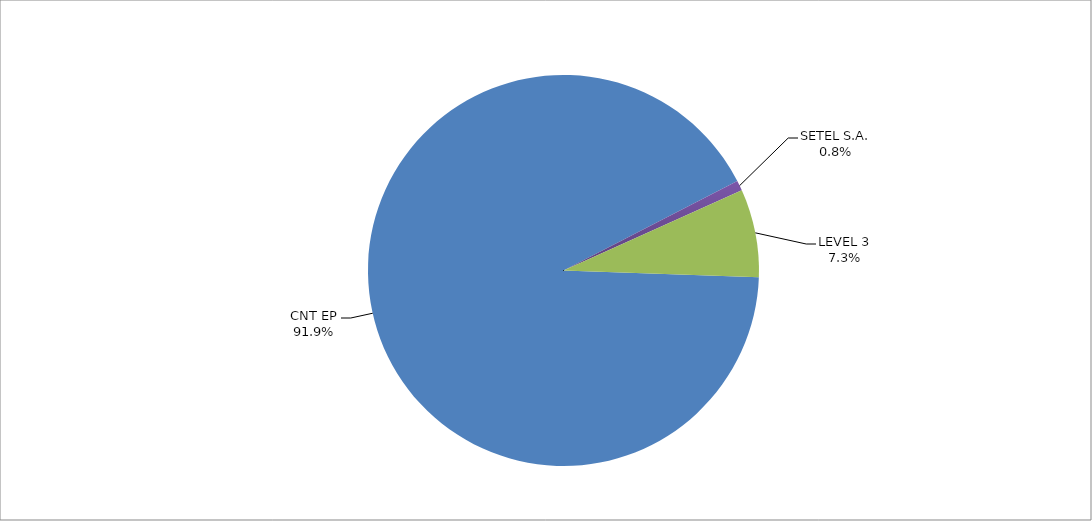
| Category | Series 0 |
|---|---|
| CNT EP | 328 |
| SETEL S.A. | 3 |
| LEVEL 3 | 26 |